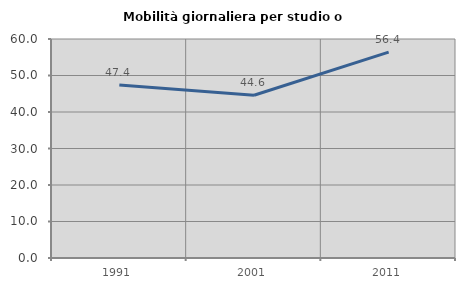
| Category | Mobilità giornaliera per studio o lavoro |
|---|---|
| 1991.0 | 47.373 |
| 2001.0 | 44.582 |
| 2011.0 | 56.389 |